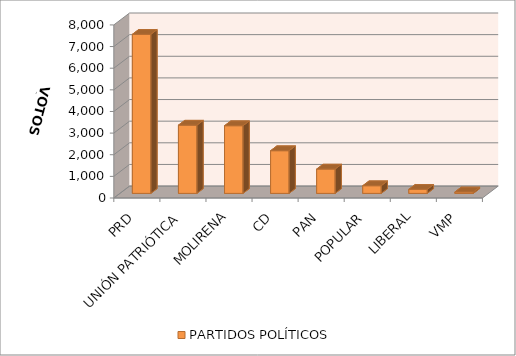
| Category | PARTIDOS POLÍTICOS |
|---|---|
| PRD | 7352 |
| UNIÓN PATRIÓTICA | 3154 |
| MOLIRENA | 3128 |
| CD | 1973 |
| PAN | 1124 |
| POPULAR | 354 |
| LIBERAL | 187 |
| VMP | 65 |